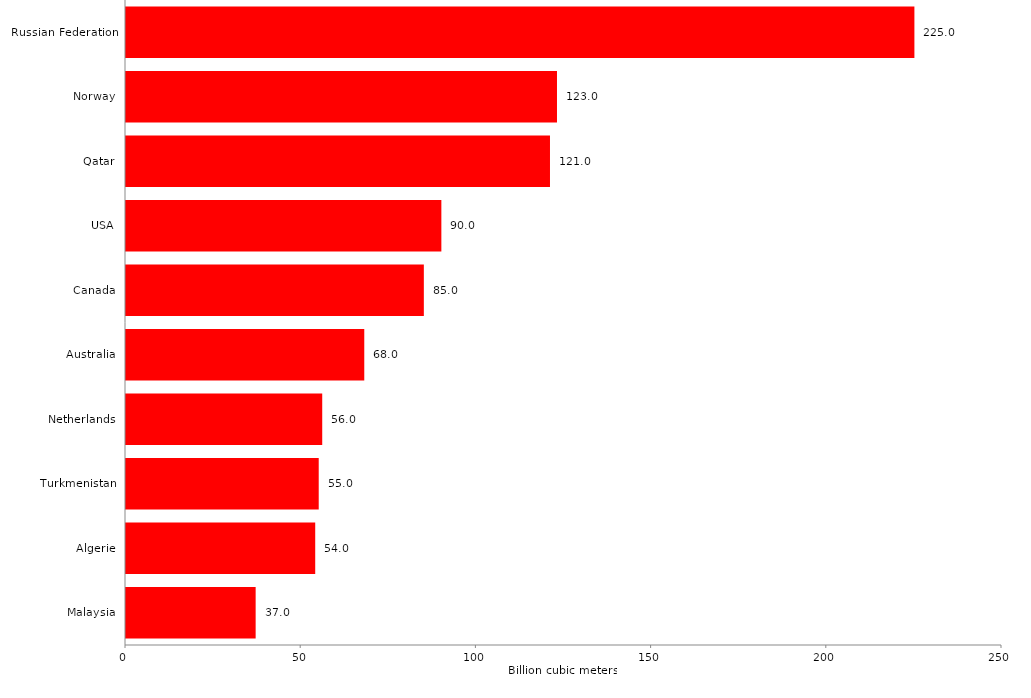
| Category |  37,0  |
|---|---|
| Malaysia | 37 |
| Algerie | 54 |
| Turkmenistan | 55 |
| Netherlands | 56 |
| Australia | 68 |
| Canada | 85 |
| USA | 90 |
| Qatar | 121 |
| Norway | 123 |
| Russian Federation | 225 |